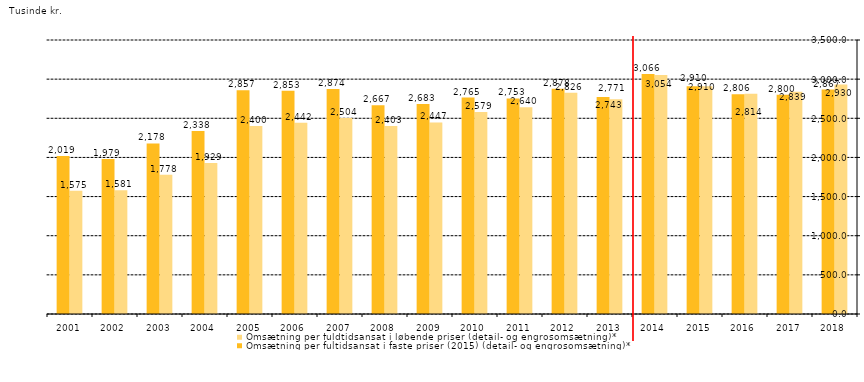
| Category | Omsætning per fuldtidsansat i løbende priser (detail- og engrosomsætning)* | Omsætning per fultidsansat i faste priser (2015) (detail- og engrosomsætning)* |
|---|---|---|
| 2018.0 | 2930.386 | 2867.305 |
| 2017.0 | 2839.243 | 2800.043 |
| 2016.0 | 2814.009 | 2805.592 |
| 2015.0 | 2909.957 | 2909.957 |
| 2014.0 | 3053.861 | 3066.125 |
| 2013.0 | 2743.446 | 2771.157 |
| 2012.0 | 2826.498 | 2878.308 |
| 2011.0 | 2639.909 | 2752.773 |
| 2010.0 | 2579.448 | 2764.682 |
| 2009.0 | 2446.635 | 2682.714 |
| 2008.0 | 2402.858 | 2666.878 |
| 2007.0 | 2503.615 | 2874.415 |
| 2006.0 | 2441.839 | 2852.616 |
| 2005.0 | 2399.899 | 2857.023 |
| 2004.0 | 1928.865 | 2338.019 |
| 2003.0 | 1777.589 | 2178.418 |
| 2002.0 | 1581.306 | 1979.107 |
| 2001.0 | 1574.548 | 2018.651 |